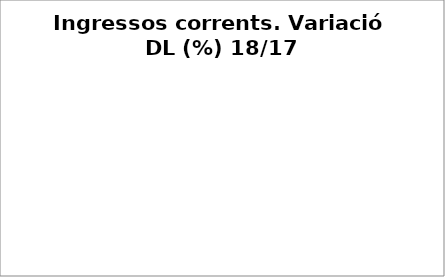
| Category | Series 0 |
|---|---|
| Impostos locals | -0.053 |
| Participació Tributs de l'Estat | 0.057 |
| Taxes i altres ingressos | 0.046 |
| Transferències corrents (exc. FCF) | 0.101 |
| Ingressos patrimonials | -0.165 |
| Ingressos corrents | -0.019 |